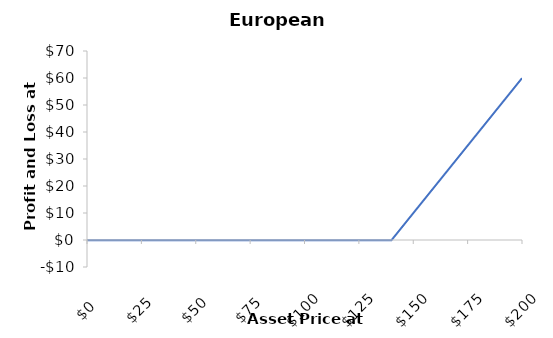
| Category | European Call |
|---|---|
| 0.0 | -0.059 |
| 1.0 | -0.059 |
| 2.0 | -0.059 |
| 3.0 | -0.059 |
| 4.0 | -0.059 |
| 5.0 | -0.059 |
| 6.0 | -0.059 |
| 7.0 | -0.059 |
| 8.0 | -0.059 |
| 9.0 | -0.059 |
| 10.0 | -0.059 |
| 11.0 | -0.059 |
| 12.0 | -0.059 |
| 13.0 | -0.059 |
| 14.0 | -0.059 |
| 15.0 | -0.059 |
| 16.0 | -0.059 |
| 17.0 | -0.059 |
| 18.0 | -0.059 |
| 19.0 | -0.059 |
| 20.0 | -0.059 |
| 21.0 | -0.059 |
| 22.0 | -0.059 |
| 23.0 | -0.059 |
| 24.0 | -0.059 |
| 25.0 | -0.059 |
| 26.0 | -0.059 |
| 27.0 | -0.059 |
| 28.0 | -0.059 |
| 29.0 | -0.059 |
| 30.0 | -0.059 |
| 31.0 | -0.059 |
| 32.0 | -0.059 |
| 33.0 | -0.059 |
| 34.0 | -0.059 |
| 35.0 | -0.059 |
| 36.0 | -0.059 |
| 37.0 | -0.059 |
| 38.0 | -0.059 |
| 39.0 | -0.059 |
| 40.0 | -0.059 |
| 41.0 | -0.059 |
| 42.0 | -0.059 |
| 43.0 | -0.059 |
| 44.0 | -0.059 |
| 45.0 | -0.059 |
| 46.0 | -0.059 |
| 47.0 | -0.059 |
| 48.0 | -0.059 |
| 49.0 | -0.059 |
| 50.0 | -0.059 |
| 51.0 | -0.059 |
| 52.0 | -0.059 |
| 53.0 | -0.059 |
| 54.0 | -0.059 |
| 55.0 | -0.059 |
| 56.0 | -0.059 |
| 57.0 | -0.059 |
| 58.0 | -0.059 |
| 59.0 | -0.059 |
| 60.0 | -0.059 |
| 61.0 | -0.059 |
| 62.0 | -0.059 |
| 63.0 | -0.059 |
| 64.0 | -0.059 |
| 65.0 | -0.059 |
| 66.0 | -0.059 |
| 67.0 | -0.059 |
| 68.0 | -0.059 |
| 69.0 | -0.059 |
| 70.0 | -0.059 |
| 71.0 | -0.059 |
| 72.0 | -0.059 |
| 73.0 | -0.059 |
| 74.0 | -0.059 |
| 75.0 | -0.059 |
| 76.0 | -0.059 |
| 77.0 | -0.059 |
| 78.0 | -0.059 |
| 79.0 | -0.059 |
| 80.0 | -0.059 |
| 81.0 | -0.059 |
| 82.0 | -0.059 |
| 83.0 | -0.059 |
| 84.0 | -0.059 |
| 85.0 | -0.059 |
| 86.0 | -0.059 |
| 87.0 | -0.059 |
| 88.0 | -0.059 |
| 89.0 | -0.059 |
| 90.0 | -0.059 |
| 91.0 | -0.059 |
| 92.0 | -0.059 |
| 93.0 | -0.059 |
| 94.0 | -0.059 |
| 95.0 | -0.059 |
| 96.0 | -0.059 |
| 97.0 | -0.059 |
| 98.0 | -0.059 |
| 99.0 | -0.059 |
| 100.0 | -0.059 |
| 101.0 | -0.059 |
| 102.0 | -0.059 |
| 103.0 | -0.059 |
| 104.0 | -0.059 |
| 105.0 | -0.059 |
| 106.0 | -0.059 |
| 107.0 | -0.059 |
| 108.0 | -0.059 |
| 109.0 | -0.059 |
| 110.0 | -0.059 |
| 111.0 | -0.059 |
| 112.0 | -0.059 |
| 113.0 | -0.059 |
| 114.0 | -0.059 |
| 115.0 | -0.059 |
| 116.0 | -0.059 |
| 117.0 | -0.059 |
| 118.0 | -0.059 |
| 119.0 | -0.059 |
| 120.0 | -0.059 |
| 121.0 | -0.059 |
| 122.0 | -0.059 |
| 123.0 | -0.059 |
| 124.0 | -0.059 |
| 125.0 | -0.059 |
| 126.0 | -0.059 |
| 127.0 | -0.059 |
| 128.0 | -0.059 |
| 129.0 | -0.059 |
| 130.0 | -0.059 |
| 131.0 | -0.059 |
| 132.0 | -0.059 |
| 133.0 | -0.059 |
| 134.0 | -0.059 |
| 135.0 | -0.059 |
| 136.0 | -0.059 |
| 137.0 | -0.059 |
| 138.0 | -0.059 |
| 139.0 | -0.059 |
| 140.0 | -0.059 |
| 141.0 | 0.941 |
| 142.0 | 1.941 |
| 143.0 | 2.941 |
| 144.0 | 3.941 |
| 145.0 | 4.941 |
| 146.0 | 5.941 |
| 147.0 | 6.941 |
| 148.0 | 7.941 |
| 149.0 | 8.941 |
| 150.0 | 9.941 |
| 151.0 | 10.941 |
| 152.0 | 11.941 |
| 153.0 | 12.941 |
| 154.0 | 13.941 |
| 155.0 | 14.941 |
| 156.0 | 15.941 |
| 157.0 | 16.941 |
| 158.0 | 17.941 |
| 159.0 | 18.941 |
| 160.0 | 19.941 |
| 161.0 | 20.941 |
| 162.0 | 21.941 |
| 163.0 | 22.941 |
| 164.0 | 23.941 |
| 165.0 | 24.941 |
| 166.0 | 25.941 |
| 167.0 | 26.941 |
| 168.0 | 27.941 |
| 169.0 | 28.941 |
| 170.0 | 29.941 |
| 171.0 | 30.941 |
| 172.0 | 31.941 |
| 173.0 | 32.941 |
| 174.0 | 33.941 |
| 175.0 | 34.941 |
| 176.0 | 35.941 |
| 177.0 | 36.941 |
| 178.0 | 37.941 |
| 179.0 | 38.941 |
| 180.0 | 39.941 |
| 181.0 | 40.941 |
| 182.0 | 41.941 |
| 183.0 | 42.941 |
| 184.0 | 43.941 |
| 185.0 | 44.941 |
| 186.0 | 45.941 |
| 187.0 | 46.941 |
| 188.0 | 47.941 |
| 189.0 | 48.941 |
| 190.0 | 49.941 |
| 191.0 | 50.941 |
| 192.0 | 51.941 |
| 193.0 | 52.941 |
| 194.0 | 53.941 |
| 195.0 | 54.941 |
| 196.0 | 55.941 |
| 197.0 | 56.941 |
| 198.0 | 57.941 |
| 199.0 | 58.941 |
| 200.0 | 59.941 |